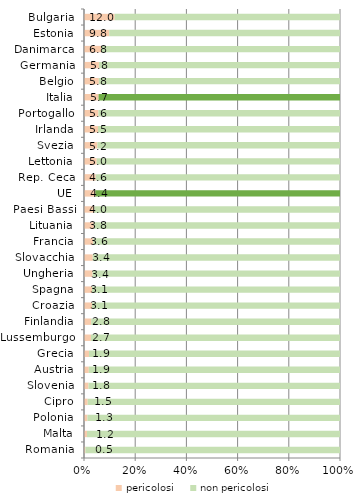
| Category | pericolosi | non pericolosi |
|---|---|---|
| Romania | 0.548 | 99.452 |
| Malta | 1.177 | 98.823 |
| Polonia | 1.325 | 98.675 |
| Cipro | 1.454 | 98.546 |
| Slovenia | 1.764 | 98.236 |
| Austria | 1.868 | 98.132 |
| Grecia | 1.948 | 98.052 |
| Lussemburgo | 2.714 | 97.286 |
| Finlandia | 2.819 | 97.181 |
| Croazia | 3.114 | 96.886 |
| Spagna | 3.129 | 96.871 |
| Ungheria | 3.358 | 96.642 |
| Slovacchia | 3.412 | 96.588 |
| Francia | 3.622 | 96.378 |
| Lituania | 3.847 | 96.153 |
| Paesi Bassi | 4.013 | 95.987 |
| UE | 4.435 | 95.565 |
| Rep. Ceca | 4.572 | 95.428 |
| Lettonia | 4.957 | 95.043 |
| Svezia | 5.235 | 94.765 |
| Irlanda | 5.478 | 94.522 |
| Portogallo | 5.634 | 94.366 |
| Italia | 5.696 | 94.304 |
| Belgio | 5.797 | 94.203 |
| Germania | 5.837 | 94.163 |
| Danimarca | 6.799 | 93.201 |
| Estonia | 9.846 | 90.154 |
| Bulgaria | 11.987 | 88.013 |